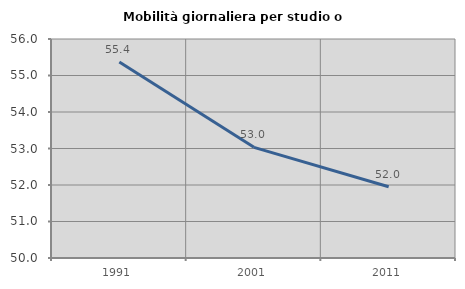
| Category | Mobilità giornaliera per studio o lavoro |
|---|---|
| 1991.0 | 55.367 |
| 2001.0 | 53.032 |
| 2011.0 | 51.953 |